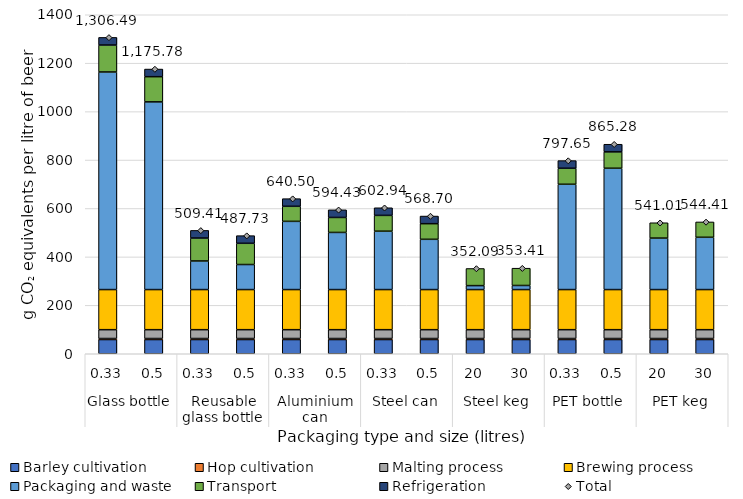
| Category | Barley cultivation | Hop cultivation | Malting process | Brewing process  | Packaging and waste | Transport | Refrigeration |
|---|---|---|---|---|---|---|---|
| 0 | 58.683 | 4.279 | 36.458 | 165.636 | 898.639 | 111.252 | 31.543 |
| 1 | 58.683 | 4.279 | 36.458 | 165.636 | 775.144 | 104.039 | 31.543 |
| 2 | 58.683 | 4.279 | 36.458 | 165.636 | 118.174 | 94.642 | 31.543 |
| 3 | 58.683 | 4.279 | 36.458 | 165.636 | 103.428 | 87.703 | 31.543 |
| 4 | 58.683 | 4.279 | 36.458 | 165.636 | 281.723 | 62.179 | 31.543 |
| 5 | 58.683 | 4.279 | 36.458 | 165.636 | 235.998 | 61.831 | 31.543 |
| 6 | 58.683 | 4.279 | 36.458 | 165.636 | 241.114 | 65.229 | 31.543 |
| 7 | 58.683 | 4.279 | 36.458 | 165.636 | 207.607 | 64.499 | 31.543 |
| 8 | 58.683 | 4.279 | 36.458 | 165.636 | 16.322 | 70.712 | 0 |
| 9 | 58.683 | 4.279 | 36.458 | 165.636 | 16.892 | 71.459 | 0 |
| 10 | 58.683 | 4.279 | 36.458 | 165.636 | 434.881 | 66.169 | 31.543 |
| 11 | 58.683 | 4.279 | 36.458 | 165.636 | 501.094 | 67.589 | 31.543 |
| 12 | 58.683 | 4.279 | 36.458 | 165.636 | 212.64 | 63.311 | 0 |
| 13 | 58.683 | 4.279 | 36.458 | 165.636 | 215.979 | 63.373 | 0 |